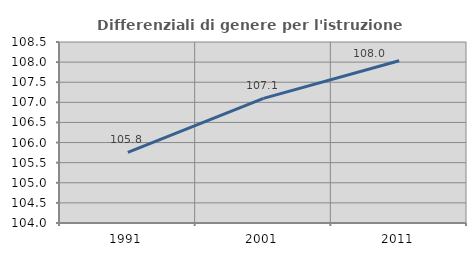
| Category | Differenziali di genere per l'istruzione superiore |
|---|---|
| 1991.0 | 105.756 |
| 2001.0 | 107.098 |
| 2011.0 | 108.036 |